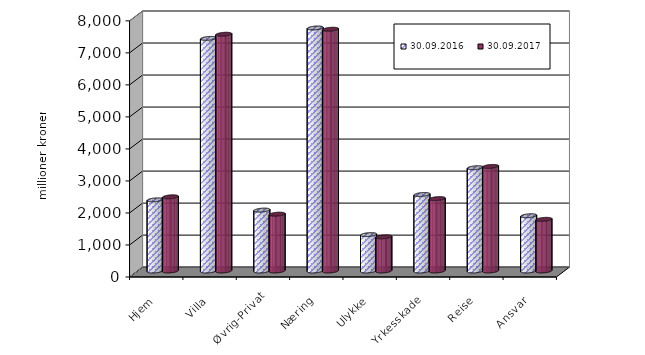
| Category | 30.09.2016 | 30.09.2017 |
|---|---|---|
| Hjem | 2222.237 | 2317.157 |
| Villa | 7265.497 | 7394.691 |
| Øvrig-Privat | 1902.373 | 1775.037 |
| Næring | 7590.132 | 7550.894 |
| Ulykke | 1136.852 | 1067.202 |
| Yrkesskade | 2389.838 | 2261.757 |
| Reise | 3225.785 | 3266.26 |
| Ansvar | 1725.801 | 1613.817 |